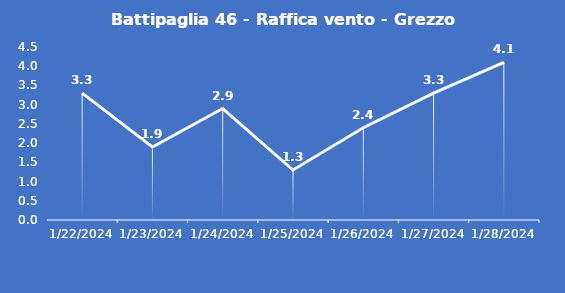
| Category | Battipaglia 46 - Raffica vento - Grezzo (m/s) |
|---|---|
| 1/22/24 | 3.3 |
| 1/23/24 | 1.9 |
| 1/24/24 | 2.9 |
| 1/25/24 | 1.3 |
| 1/26/24 | 2.4 |
| 1/27/24 | 3.3 |
| 1/28/24 | 4.1 |